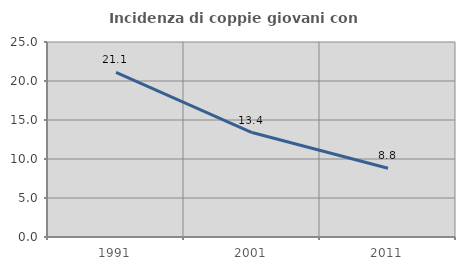
| Category | Incidenza di coppie giovani con figli |
|---|---|
| 1991.0 | 21.116 |
| 2001.0 | 13.394 |
| 2011.0 | 8.806 |